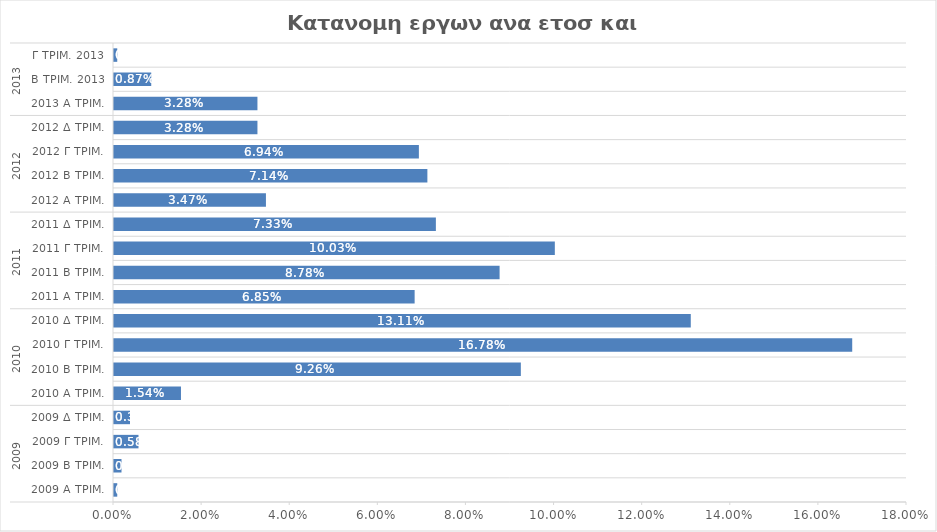
| Category | Total |
|---|---|
| 0 | 0.001 |
| 1 | 0.002 |
| 2 | 0.006 |
| 3 | 0.004 |
| 4 | 0.015 |
| 5 | 0.093 |
| 6 | 0.168 |
| 7 | 0.131 |
| 8 | 0.068 |
| 9 | 0.088 |
| 10 | 0.1 |
| 11 | 0.073 |
| 12 | 0.035 |
| 13 | 0.071 |
| 14 | 0.069 |
| 15 | 0.033 |
| 16 | 0.033 |
| 17 | 0.009 |
| 18 | 0.001 |